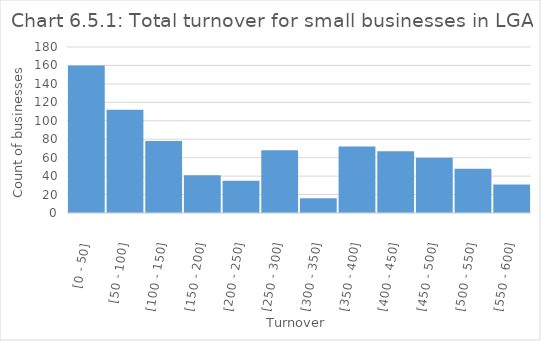
| Category | Series 0 |
|---|---|
| [0 - 50] | 160 |
| [50 - 100] | 112 |
| [100 - 150] | 78 |
| [150 - 200] | 41 |
| [200 - 250] | 35 |
| [250 - 300] | 68 |
| [300 - 350] | 16 |
| [350 - 400] | 72 |
| [400 - 450] | 67 |
| [450 - 500] | 60 |
| [500 - 550] | 48 |
| [550 - 600] | 31 |